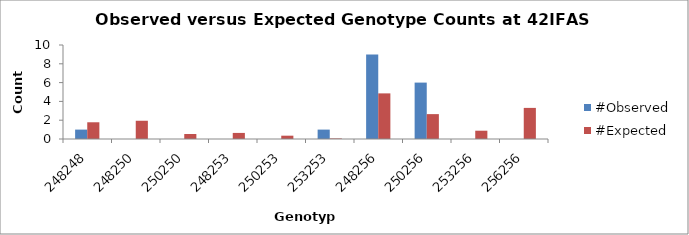
| Category | #Observed | #Expected |
|---|---|---|
| 248248.0 | 1 | 1.779 |
| 248250.0 | 0 | 1.941 |
| 250250.0 | 0 | 0.529 |
| 248253.0 | 0 | 0.647 |
| 250253.0 | 0 | 0.353 |
| 253253.0 | 1 | 0.059 |
| 248256.0 | 9 | 4.853 |
| 250256.0 | 6 | 2.647 |
| 253256.0 | 0 | 0.882 |
| 256256.0 | 0 | 3.309 |